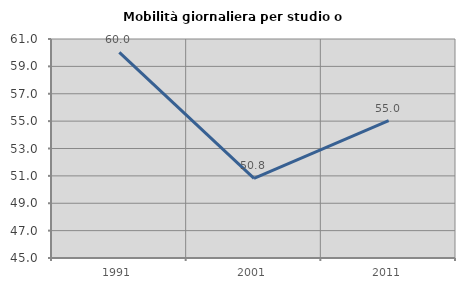
| Category | Mobilità giornaliera per studio o lavoro |
|---|---|
| 1991.0 | 60.03 |
| 2001.0 | 50.82 |
| 2011.0 | 55.034 |